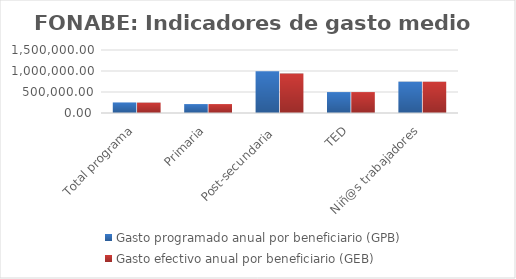
| Category | Gasto programado anual por beneficiario (GPB)  | Gasto efectivo anual por beneficiario (GEB)  |
|---|---|---|
| Total programa | 251497.891 | 247151.912 |
| Primaria | 212400 | 212396.903 |
| Post-secundaria  | 996000 | 939710.773 |
| TED | 498000 | 498016.384 |
| Niñ@s trabajadores | 746400 | 744967.37 |